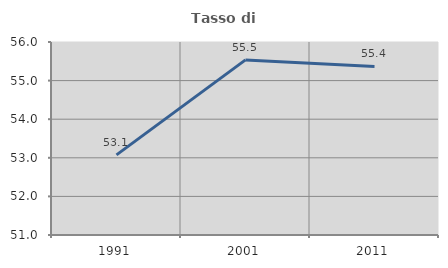
| Category | Tasso di occupazione   |
|---|---|
| 1991.0 | 53.076 |
| 2001.0 | 55.536 |
| 2011.0 | 55.367 |